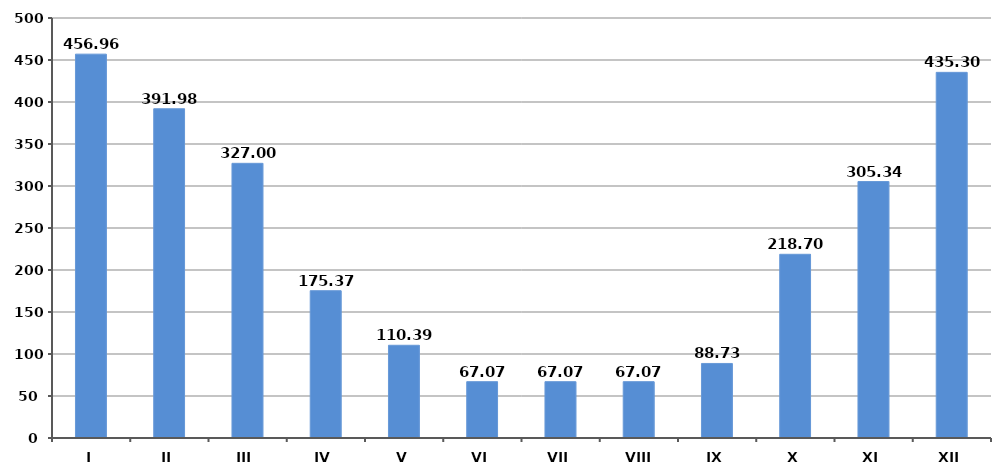
| Category | Series 0 |
|---|---|
| I | 456.962 |
| II | 391.98 |
| III | 326.999 |
| IV | 175.375 |
| V | 110.393 |
| VI | 67.072 |
| VII | 67.072 |
| VIII | 67.072 |
| IX | 88.733 |
| X | 218.696 |
| XI | 305.338 |
| XII | 435.302 |